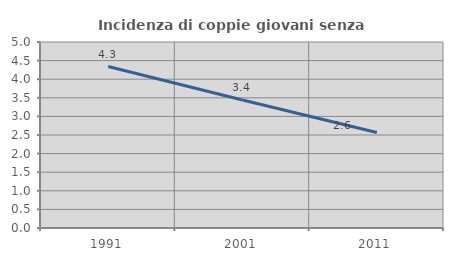
| Category | Incidenza di coppie giovani senza figli |
|---|---|
| 1991.0 | 4.339 |
| 2001.0 | 3.44 |
| 2011.0 | 2.567 |